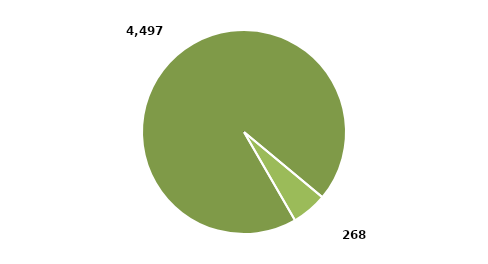
| Category | Series 0 |
|---|---|
| Hombres | 0.944 |
| Mujeres | 0.056 |